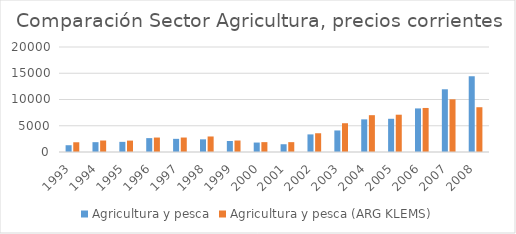
| Category | Agricultura y pesca | Agricultura y pesca (ARG KLEMS) |
|---|---|---|
| 1993.0 | 1290.12 | 1853.459 |
| 1994.0 | 1872.807 | 2187.818 |
| 1995.0 | 1931.237 | 2171.681 |
| 1996.0 | 2643.647 | 2754.923 |
| 1997.0 | 2506.783 | 2755.782 |
| 1998.0 | 2411.828 | 2956.455 |
| 1999.0 | 2092.45 | 2188.352 |
| 2000.0 | 1800.02 | 1878.888 |
| 2001.0 | 1479.342 | 1876.203 |
| 2002.0 | 3353.284 | 3571.722 |
| 2003.0 | 4102.314 | 5479.454 |
| 2004.0 | 6216.594 | 7014.209 |
| 2005.0 | 6326.268 | 7103.268 |
| 2006.0 | 8300.545 | 8388.691 |
| 2007.0 | 11946.422 | 10035.977 |
| 2008.0 | 14428.777 | 8528.602 |